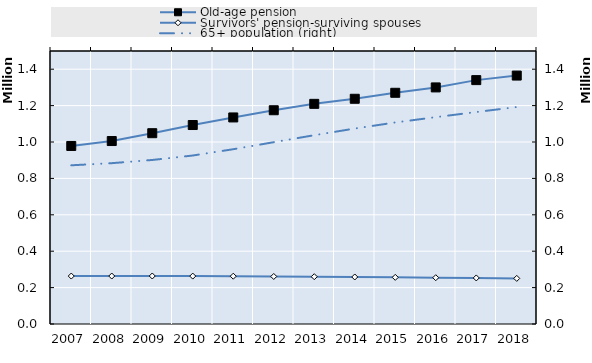
| Category | Old-age pension | Survivors' pension-surviving spouses | 0 | Series 14 | Series 15 | Series 16 | Series 17 | Series 18 | Series 19 |
|---|---|---|---|---|---|---|---|---|---|
| 2007.0 | 978278 | 263400 |  |  |  |  |  |  |  |
| 2008.0 | 1005277 | 263512 |  |  |  |  |  |  |  |
| 2009.0 | 1048379 | 263818 |  |  |  |  |  |  |  |
| 2010.0 | 1093267 | 263176 |  |  |  |  |  |  |  |
| 2011.0 | 1134942 | 262692 |  |  |  |  |  |  |  |
| 2012.0 | 1174470 | 261135 |  |  |  |  |  |  |  |
| 2013.0 | 1209645 | 259932 |  |  |  |  |  |  |  |
| 2014.0 | 1237541 | 258354 |  |  |  |  |  |  |  |
| 2015.0 | 1270408 | 256330 |  |  |  |  |  |  |  |
| 2016.0 | 1299958 | 254437 |  |  |  |  |  |  |  |
| 2017.0 | 1339991 | 253011 |  |  |  |  |  |  |  |
| 2018.0 | 1365039 | 250617 |  |  |  |  |  |  |  |